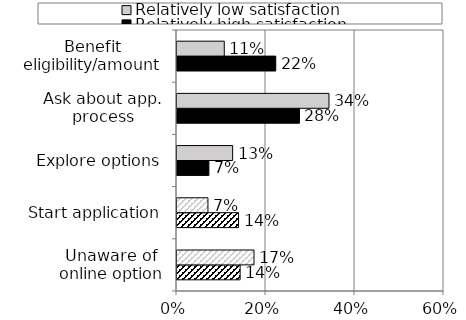
| Category | Relatively high satisfaction | Relatively low satisfaction |
|---|---|---|
| Unaware of online option | 0.142 | 0.173 |
| Start application | 0.138 | 0.07 |
| Explore options | 0.072 | 0.125 |
| Ask about app. process | 0.275 | 0.342 |
| Benefit eligibility/amount | 0.222 | 0.106 |